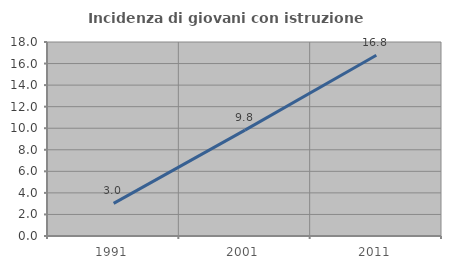
| Category | Incidenza di giovani con istruzione universitaria |
|---|---|
| 1991.0 | 3.03 |
| 2001.0 | 9.827 |
| 2011.0 | 16.766 |